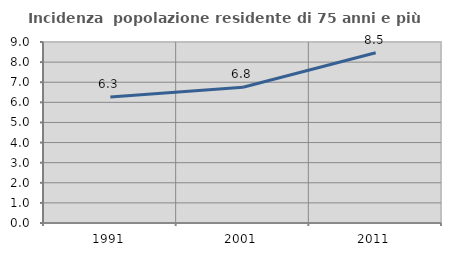
| Category | Incidenza  popolazione residente di 75 anni e più |
|---|---|
| 1991.0 | 6.263 |
| 2001.0 | 6.753 |
| 2011.0 | 8.468 |